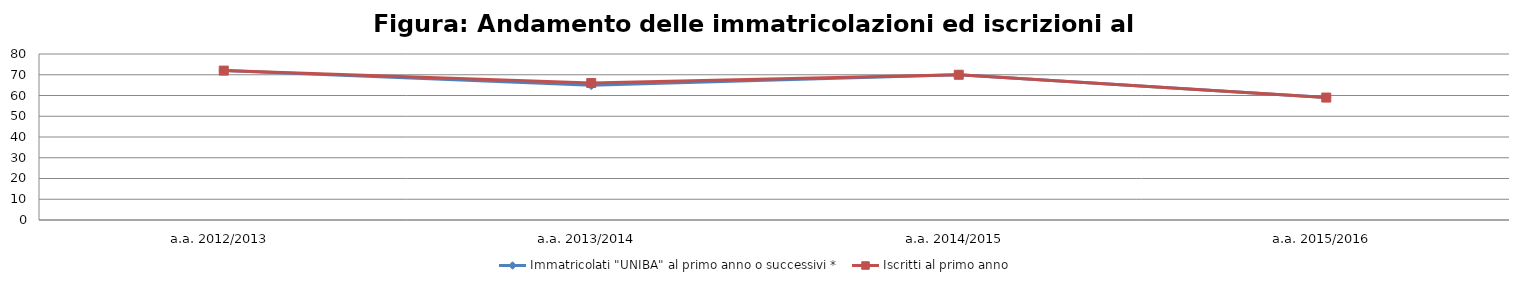
| Category | Immatricolati "UNIBA" al primo anno o successivi * | Iscritti al primo anno  |
|---|---|---|
| a.a. 2012/2013 | 72 | 72 |
| a.a. 2013/2014 | 65 | 66 |
| a.a. 2014/2015 | 70 | 70 |
| a.a. 2015/2016 | 59 | 59 |